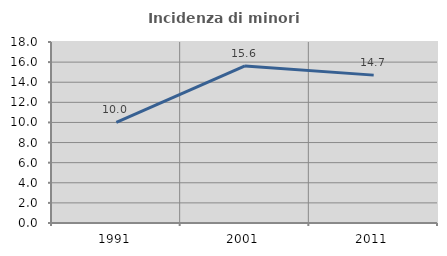
| Category | Incidenza di minori stranieri |
|---|---|
| 1991.0 | 10 |
| 2001.0 | 15.625 |
| 2011.0 | 14.706 |